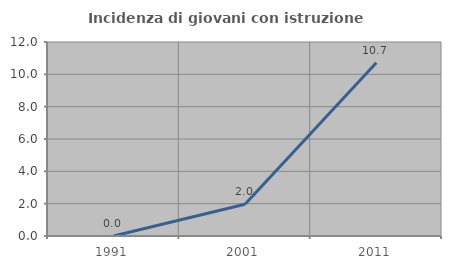
| Category | Incidenza di giovani con istruzione universitaria |
|---|---|
| 1991.0 | 0 |
| 2001.0 | 1.961 |
| 2011.0 | 10.714 |